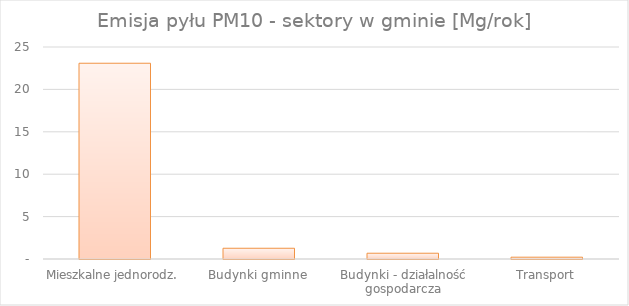
| Category | Series 0 |
|---|---|
| Mieszkalne jednorodz. | 23.084 |
| Budynki gminne | 1.267 |
| Budynki - działalność gospodarcza | 0.681 |
| Transport | 0.214 |